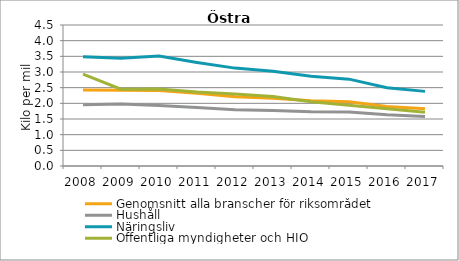
| Category | Genomsnitt alla branscher för riksområdet | Hushåll | Näringsliv | Offentliga myndigheter och HIO |
|---|---|---|---|---|
| 2008 | 2.427 | 1.952 | 3.485 | 2.93 |
| 2009 | 2.418 | 1.978 | 3.437 | 2.451 |
| 2010 | 2.412 | 1.933 | 3.509 | 2.456 |
| 2011 | 2.321 | 1.864 | 3.306 | 2.359 |
| 2012 | 2.213 | 1.794 | 3.124 | 2.295 |
| 2013 | 2.164 | 1.772 | 3.021 | 2.22 |
| 2014 | 2.082 | 1.73 | 2.867 | 2.048 |
| 2015 | 2.047 | 1.721 | 2.772 | 1.94 |
| 2016 | 1.901 | 1.634 | 2.496 | 1.827 |
| 2017 | 1.823 | 1.576 | 2.382 | 1.714 |